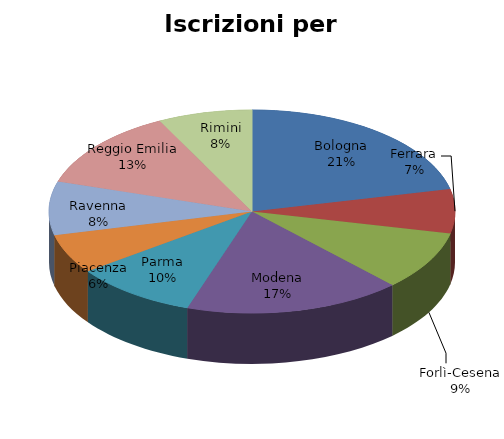
| Category | IOL |
|---|---|
| Bologna | 23782 |
| Ferrara | 7770 |
| Forlì-Cesena | 10432 |
| Modena | 19160 |
| Parma | 10897 |
| Piacenza | 6964 |
| Ravenna | 9422 |
| Reggio Emilia | 14124 |
| Rimini | 8319 |